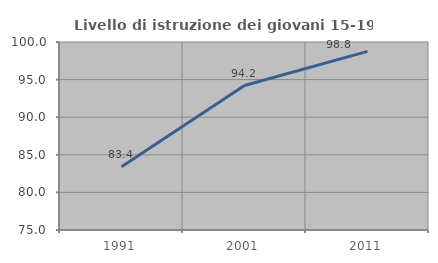
| Category | Livello di istruzione dei giovani 15-19 anni |
|---|---|
| 1991.0 | 83.42 |
| 2001.0 | 94.215 |
| 2011.0 | 98.75 |